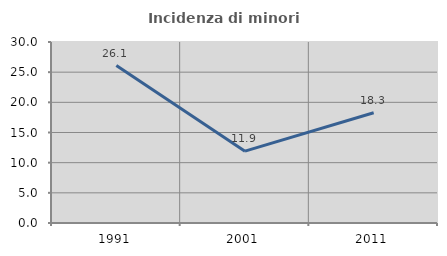
| Category | Incidenza di minori stranieri |
|---|---|
| 1991.0 | 26.087 |
| 2001.0 | 11.905 |
| 2011.0 | 18.276 |